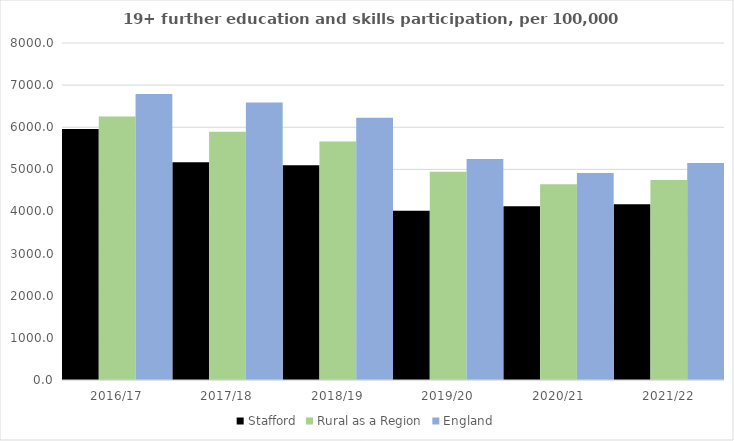
| Category | Stafford | Rural as a Region | England |
|---|---|---|---|
| 2016/17 | 5961 | 6253.401 | 6788 |
| 2017/18 | 5168 | 5892.029 | 6588 |
| 2018/19 | 5099 | 5661.873 | 6227 |
| 2019/20 | 4018 | 4943.801 | 5244 |
| 2020/21 | 4125 | 4646.727 | 4913 |
| 2021/22 | 4174 | 4747.049 | 5151 |